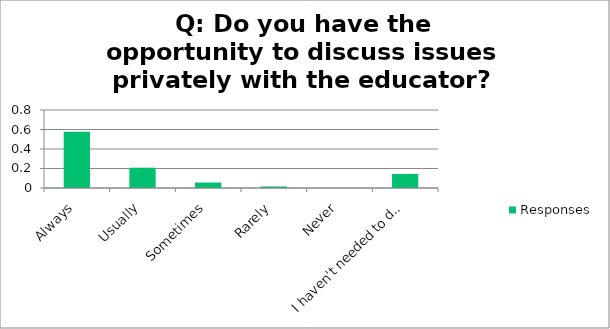
| Category | Responses |
|---|---|
| Always | 0.576 |
| Usually | 0.208 |
| Sometimes | 0.056 |
| Rarely | 0.016 |
| Never | 0 |
| I haven't needed to discuss a matter privately | 0.144 |